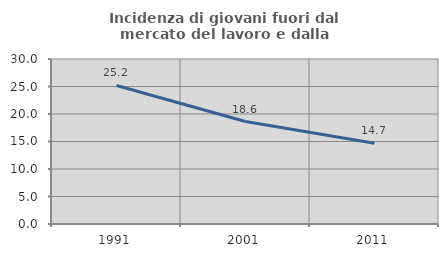
| Category | Incidenza di giovani fuori dal mercato del lavoro e dalla formazione  |
|---|---|
| 1991.0 | 25.191 |
| 2001.0 | 18.627 |
| 2011.0 | 14.667 |